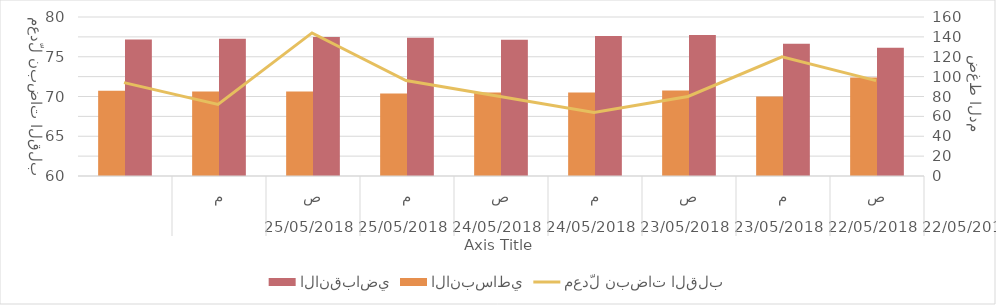
| Category | الانقباضي | الانبساطي |
|---|---|---|
| 0 | 129 | 99 |
| 01/01/1900 | 133 | 80 |
| 02/01/1900 | 142 | 86 |
| 03/01/1900 | 141 | 84 |
| 04/01/1900 | 137 | 84 |
| 05/01/1900 | 139 | 83 |
| 06/01/1900 | 140 | 85 |
| 07/01/1900 | 138 | 85 |